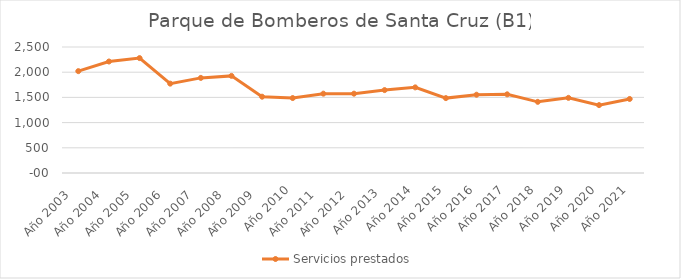
| Category | Servicios prestados  |
|---|---|
| Año 2003   | 2021 |
| Año 2004   | 2212 |
| Año 2005   | 2280 |
| Año 2006   | 1773 |
| Año 2007   | 1887 |
| Año 2008   | 1927 |
| Año 2009   | 1514 |
| Año 2010 | 1487 |
| Año 2011   | 1574 |
| Año 2012   | 1574 |
| Año 2013  | 1645 |
| Año 2014 | 1699 |
| Año 2015 | 1486 |
| Año 2016 | 1553 |
| Año 2017 | 1561 |
| Año 2018 | 1412 |
| Año 2019 | 1491 |
| Año 2020 | 1347 |
| Año 2021 | 1469 |